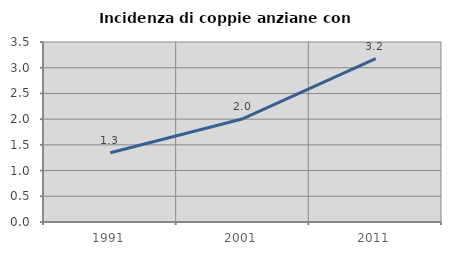
| Category | Incidenza di coppie anziane con figli |
|---|---|
| 1991.0 | 1.345 |
| 2001.0 | 2.009 |
| 2011.0 | 3.178 |